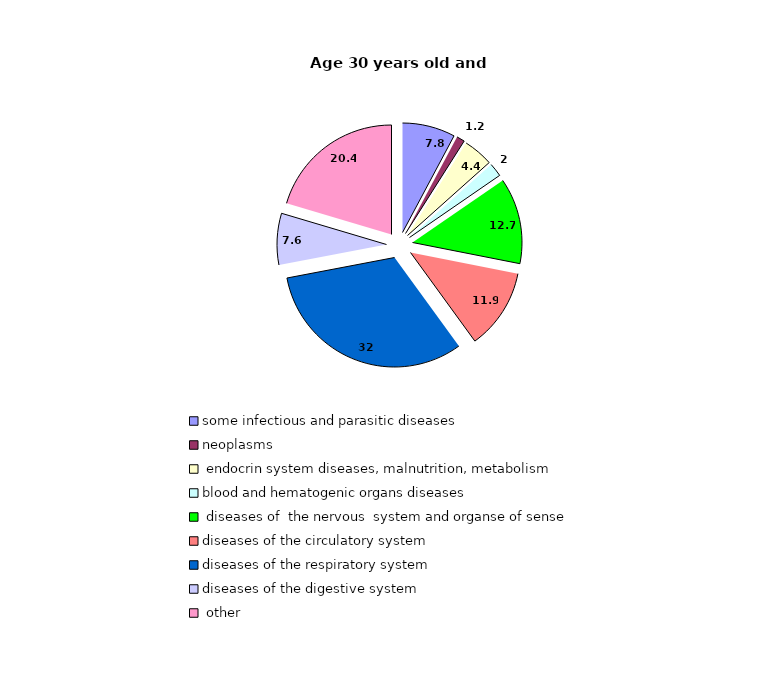
| Category | Series 0 |
|---|---|
| some infectious and parasitic diseases | 7.8 |
| neoplasms | 1.2 |
|  endocrin system diseases, malnutrition, metabolism  | 4.4 |
| blood and hematogenic organs diseases  | 2 |
|  diseases of  the nervous  system and organse of sense | 12.7 |
| diseases of the circulatory system | 11.9 |
| diseases of the respiratory system  | 32 |
| diseases of the digestive system  | 7.6 |
|  other | 20.4 |